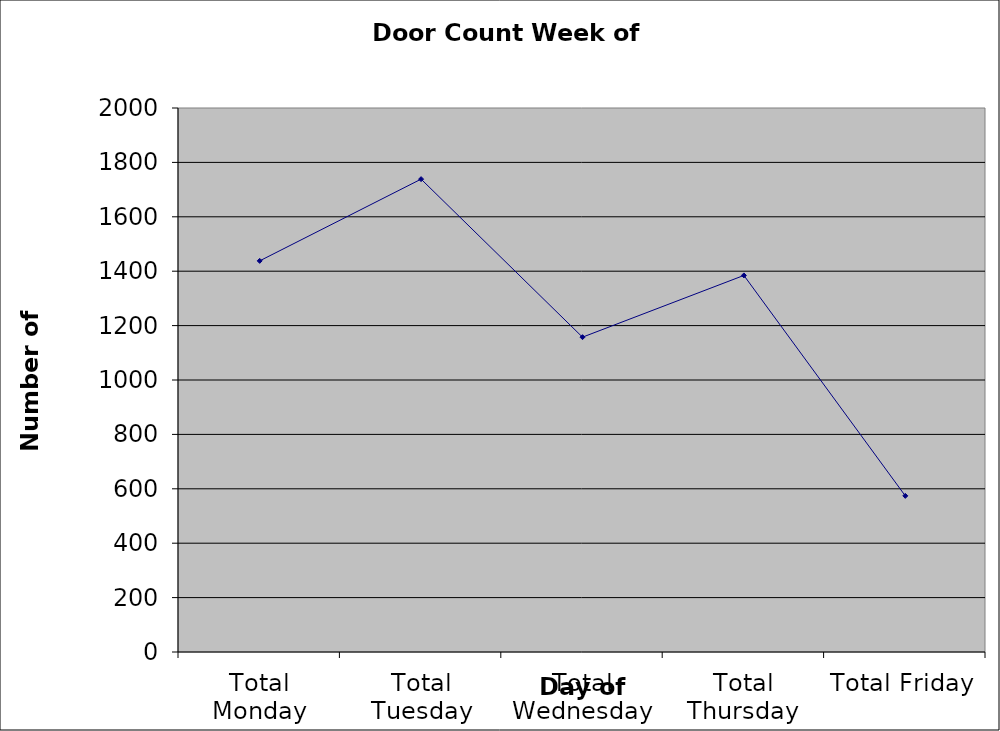
| Category | Series 0 |
|---|---|
| Total Monday | 1438 |
| Total Tuesday | 1738.5 |
| Total Wednesday | 1157.5 |
| Total Thursday | 1384.5 |
| Total Friday | 574 |